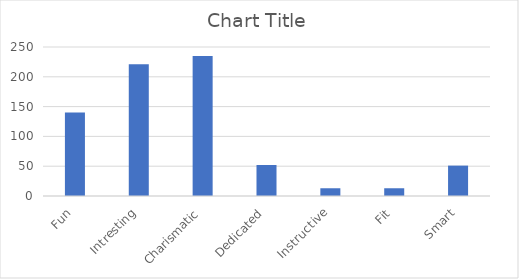
| Category | Series 0 |
|---|---|
| Fun | 140 |
| Intresting | 221 |
| Charismatic | 235 |
| Dedicated | 52 |
| Instructive | 13 |
| Fit | 13 |
| Smart | 51 |